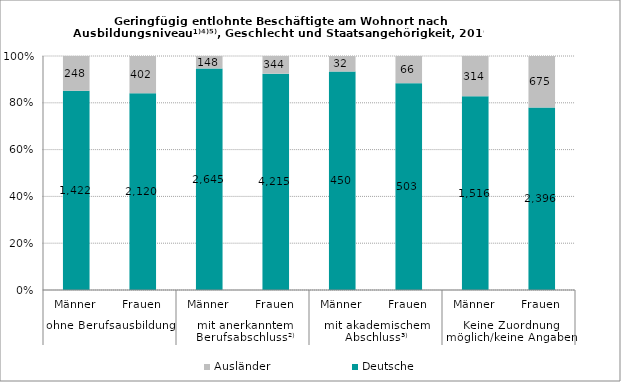
| Category | Deutsche | Ausländer |
|---|---|---|
| 0 | 1422 | 248 |
| 1 | 2120 | 402 |
| 2 | 2645 | 148 |
| 3 | 4215 | 344 |
| 4 | 450 | 32 |
| 5 | 503 | 66 |
| 6 | 1516 | 314 |
| 7 | 2396 | 675 |